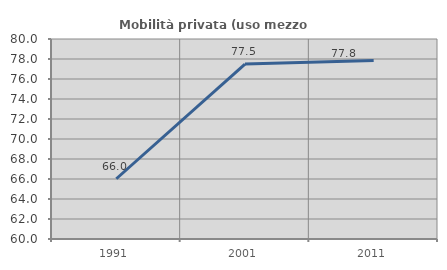
| Category | Mobilità privata (uso mezzo privato) |
|---|---|
| 1991.0 | 66.025 |
| 2001.0 | 77.494 |
| 2011.0 | 77.842 |